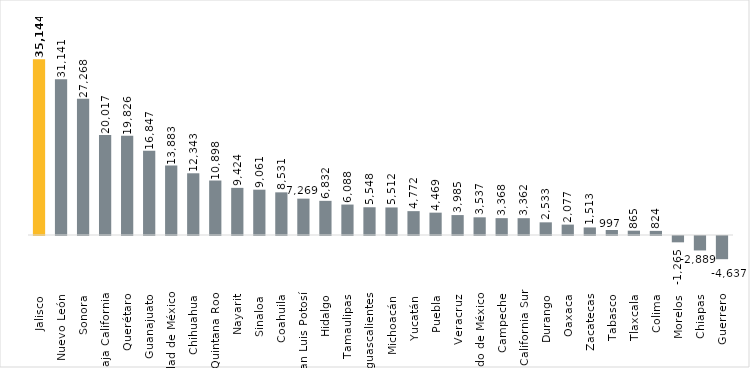
| Category | Series 0 |
|---|---|
| Jalisco | 35144 |
| Nuevo León | 31141 |
| Sonora | 27268 |
| Baja California | 20017 |
| Querétaro | 19826 |
| Guanajuato | 16847 |
| Ciudad de México | 13883 |
| Chihuahua | 12343 |
| Quintana Roo | 10898 |
| Nayarit | 9424 |
| Sinaloa | 9061 |
| Coahuila | 8531 |
| San Luis Potosí | 7269 |
| Hidalgo | 6832 |
| Tamaulipas | 6088 |
| Aguascalientes | 5548 |
| Michoacán | 5512 |
| Yucatán | 4772 |
| Puebla | 4469 |
| Veracruz | 3985 |
| Estado de México | 3537 |
| Campeche | 3368 |
| Baja California Sur | 3362 |
| Durango | 2533 |
| Oaxaca | 2077 |
| Zacatecas | 1513 |
| Tabasco | 997 |
| Tlaxcala | 865 |
| Colima | 824 |
| Morelos | -1265 |
| Chiapas | -2889 |
| Guerrero | -4637 |